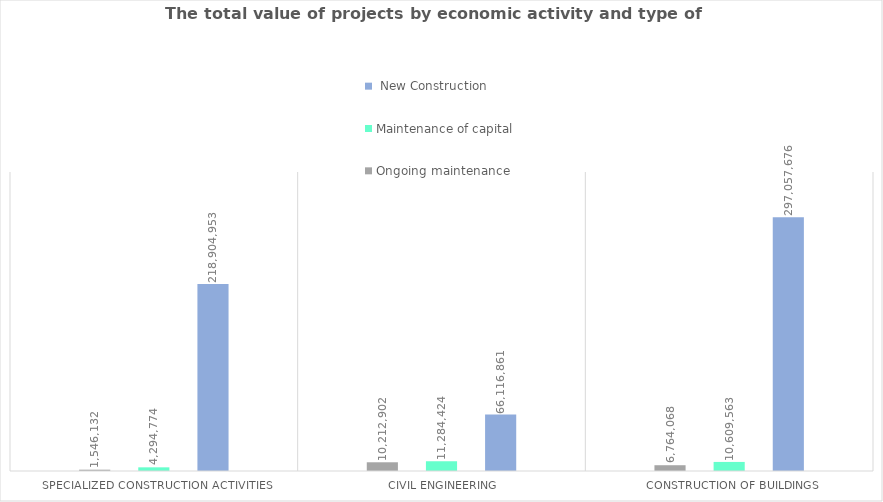
| Category |   New Construction  |  Maintenance of capital  |  Ongoing maintenance  |
|---|---|---|---|
|  Construction of buildings | 297057675.963 | 10609562.961 | 6764068.076 |
| Civil engineering | 66116860.544 | 11284423.981 | 10212902.474 |
| Specialized construction activities | 218904953.253 | 4294774.308 | 1546132.44 |